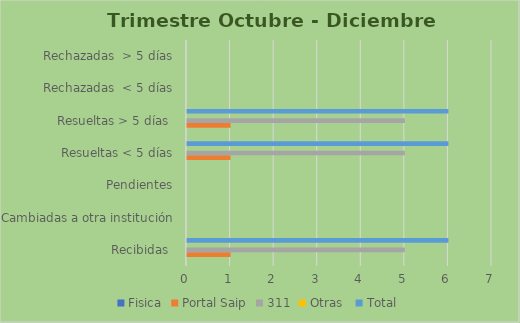
| Category | Fisica | Portal Saip | 311 | Otras  | Total |
|---|---|---|---|---|---|
| Recibidas  | 0 | 1 | 5 | 0 | 6 |
| Cambiadas a otra institución | 0 | 0 | 0 | 0 | 0 |
| Pendientes | 0 | 0 | 0 | 0 | 0 |
| Resueltas < 5 días | 0 | 1 | 5 | 0 | 6 |
| Resueltas > 5 días  | 0 | 1 | 5 | 0 | 6 |
| Rechazadas  < 5 días | 0 | 0 | 0 | 0 | 0 |
| Rechazadas  > 5 días | 0 | 0 | 0 | 0 | 0 |